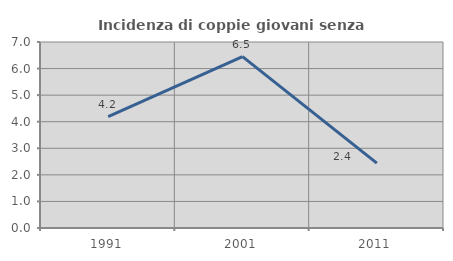
| Category | Incidenza di coppie giovani senza figli |
|---|---|
| 1991.0 | 4.196 |
| 2001.0 | 6.452 |
| 2011.0 | 2.439 |